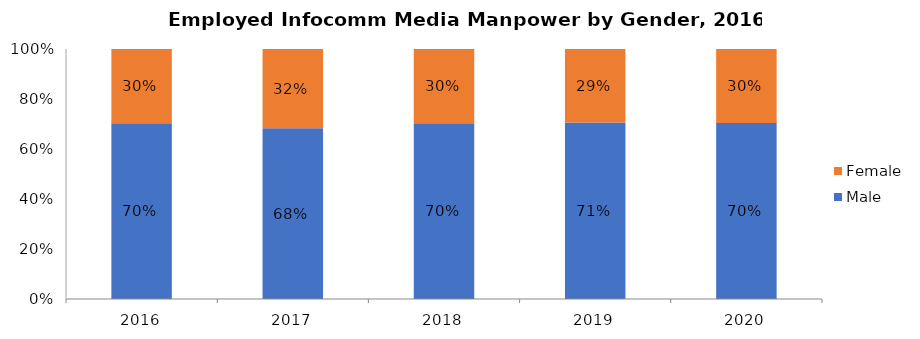
| Category | Male | Female |
|---|---|---|
| 2016.0 | 0.703 | 0.297 |
| 2017.0 | 0.683 | 0.317 |
| 2018.0 | 0.703 | 0.297 |
| 2019.0 | 0.706 | 0.294 |
| 2020.0 | 0.7 | 0.295 |